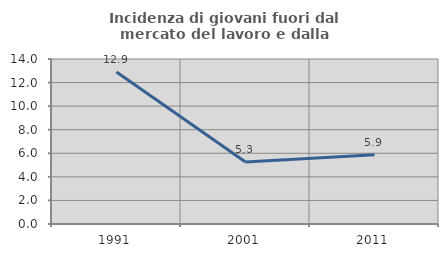
| Category | Incidenza di giovani fuori dal mercato del lavoro e dalla formazione  |
|---|---|
| 1991.0 | 12.903 |
| 2001.0 | 5.263 |
| 2011.0 | 5.882 |